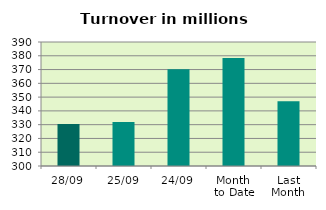
| Category | Series 0 |
|---|---|
| 28/09 | 330.548 |
| 25/09 | 331.958 |
| 24/09 | 370.227 |
| Month 
to Date | 378.367 |
| Last
Month | 347.074 |